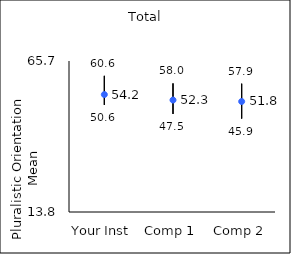
| Category | 25th percentile | 75th percentile | Mean |
|---|---|---|---|
| Your Inst | 50.6 | 60.6 | 54.17 |
| Comp 1 | 47.5 | 58 | 52.28 |
| Comp 2 | 45.9 | 57.9 | 51.78 |